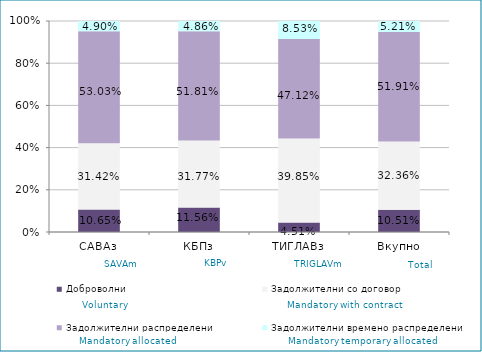
| Category | Доброволни  | Задолжителни со договор  | Задолжителни распределени  | Задолжителни времено распределени  |
|---|---|---|---|---|
| САВАз | 0.107 | 0.314 | 0.53 | 0.049 |
| КБПз | 0.116 | 0.318 | 0.518 | 0.049 |
| ТИГЛАВз | 0.045 | 0.398 | 0.471 | 0.085 |
| Вкупно | 0.105 | 0.324 | 0.519 | 0.052 |